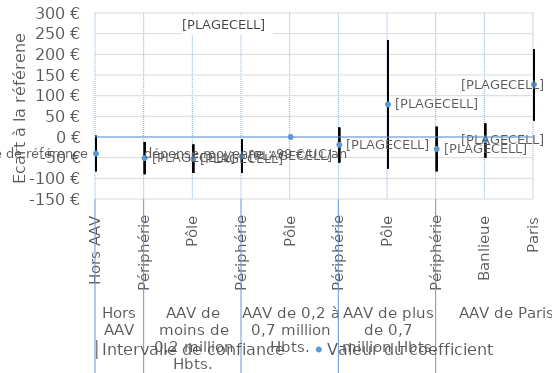
| Category | │Intervalle de confiance | Series 1 | Valeur du coefficient |
|---|---|---|---|
| 0 | 3 | -83 | -40 |
| 1 | -12 | -90 | -51 |
| 2 | -18 | -87 | -53 |
| 3 | -6 | -87 | -47 |
| 4 | 0 | 0 | 0 |
| 5 | 23 | -62 | -19 |
| 6 | 234 | -76 | 79 |
| 7 | 25 | -83 | -29 |
| 8 | 33 | -50 | -8 |
| 9 | 213 | 40 | 127 |